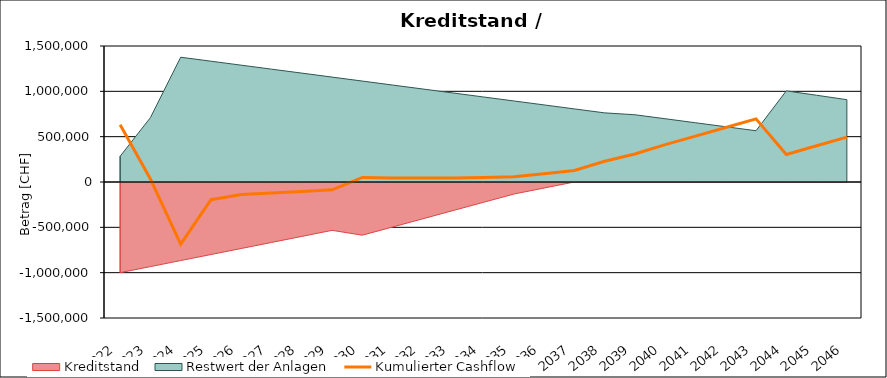
| Category | Kumulierter Cashflow |
|---|---|
| 2022.0 | 630600 |
| 2023.0 | 32526 |
| 2024.0 | -684972.442 |
| 2025.0 | -194817.24 |
| 2026.0 | -137617.291 |
| 2027.0 | -122618.606 |
| 2028.0 | -105571.978 |
| 2029.0 | -86473.545 |
| 2030.0 | 49880.595 |
| 2031.0 | 45254.381 |
| 2032.0 | 43651.796 |
| 2033.0 | 45076.857 |
| 2034.0 | 49533.625 |
| 2035.0 | 57026.201 |
| 2036.0 | 90598.726 |
| 2037.0 | 126255.383 |
| 2038.0 | 229000.397 |
| 2039.0 | 308951.989 |
| 2040.0 | 412553.228 |
| 2041.0 | 506589.086 |
| 2042.0 | 601063.961 |
| 2043.0 | 695982.292 |
| 2044.0 | 303272.549 |
| 2045.0 | 399091.292 |
| 2046.0 | 495367.081 |